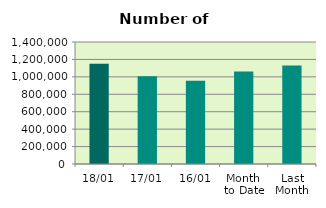
| Category | Series 0 |
|---|---|
| 18/01 | 1150534 |
| 17/01 | 1007864 |
| 16/01 | 955038 |
| Month 
to Date | 1062450.154 |
| Last
Month | 1131500.526 |